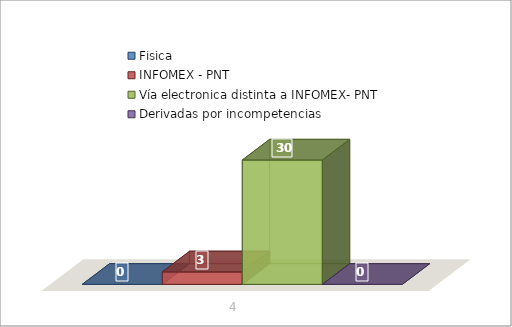
| Category | Fisica | INFOMEX - PNT | Vía electronica distinta a INFOMEX- PNT | Derivadas por incompetencias |
|---|---|---|---|---|
| 0 | 0 | 3 | 30 | 0 |